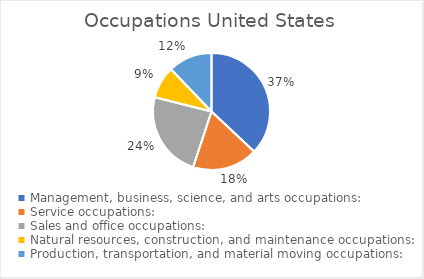
| Category | Series 0 |
|---|---|
| Management, business, science, and arts occupations: | 54751318 |
| Service occupations: | 26765182 |
| Sales and office occupations: | 35282759 |
| Natural resources, construction, and maintenance occupations: | 13171632 |
| Production, transportation, and material moving occupations: | 18030435 |